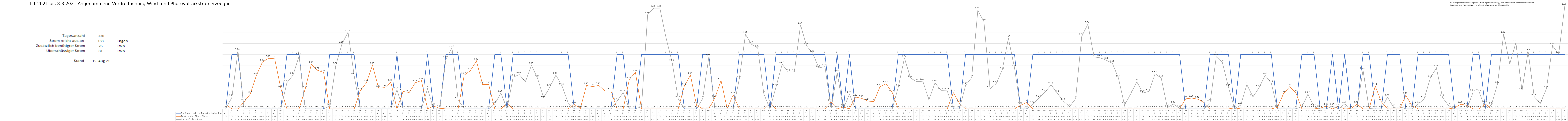
| Category | 1 = Strom reicht im Tagesdurchschnitt aus | Zusätzlich benötigter Strom | Überschüssiger Strom |
|---|---|---|---|
| 0 | 0 | 0.08 | 0 |
| 1 | 1 | 0 | 0.21 |
| 2 | 1 | 0 | 1.06 |
| 3 | 0 | 0.13 | 0 |
| 4 | 0 | 0.27 | 0 |
| 5 | 0 | 0.61 | 0 |
| 6 | 0 | 0.86 | 0 |
| 7 | 0 | 0.93 | 0 |
| 8 | 0 | 0.92 | 0 |
| 9 | 0 | 0.38 | 0 |
| 10 | 1 | 0 | 0.48 |
| 11 | 1 | 0 | 0.62 |
| 12 | 1 | 0 | 0.97 |
| 13 | 0 | 0.37 | 0 |
| 14 | 0 | 0.82 | 0 |
| 15 | 0 | 0.71 | 0 |
| 16 | 0 | 0.67 | 0 |
| 17 | 1 | 0 | 0.05 |
| 18 | 1 | 0 | 0.8 |
| 19 | 1 | 0 | 1.19 |
| 20 | 1 | 0 | 1.41 |
| 21 | 1 | 0 | 0.61 |
| 22 | 0 | 0.33 | 0 |
| 23 | 0 | 0.48 | 0 |
| 24 | 0 | 0.8 | 0 |
| 25 | 0 | 0.38 | 0 |
| 26 | 0 | 0.39 | 0 |
| 27 | 0 | 0.49 | 0 |
| 28 | 1 | 0 | 0.35 |
| 29 | 0 | 0.32 | 0 |
| 30 | 0 | 0.3 | 0 |
| 31 | 0 | 0.48 | 0 |
| 32 | 0 | 0.52 | 0 |
| 33 | 1 | 0 | 0.37 |
| 34 | 0 | 0.05 | 0 |
| 35 | 0 | 0.01 | 0 |
| 36 | 1 | 0 | 0.91 |
| 37 | 1 | 0 | 1.12 |
| 38 | 1 | 0 | 0.17 |
| 39 | 0 | 0.62 | 0 |
| 40 | 0 | 0.7 | 0 |
| 41 | 0 | 0.88 | 0 |
| 42 | 0 | 0.45 | 0 |
| 43 | 0 | 0.45 | 0 |
| 44 | 1 | 0 | 0.09 |
| 45 | 1 | 0 | 0.29 |
| 46 | 0 | 0.1 | 0 |
| 47 | 1 | 0 | 0.58 |
| 48 | 1 | 0 | 0.63 |
| 49 | 1 | 0 | 0.5 |
| 50 | 1 | 0 | 0.8 |
| 51 | 1 | 0 | 0.56 |
| 52 | 1 | 0 | 0.2 |
| 53 | 1 | 0 | 0.4 |
| 54 | 1 | 0 | 0.62 |
| 55 | 1 | 0 | 0.42 |
| 56 | 1 | 0 | 0.11 |
| 57 | 0 | 0.08 | 0 |
| 58 | 0 | 0.01 | 0 |
| 59 | 0 | 0.43 | 0 |
| 60 | 0 | 0.41 | 0 |
| 61 | 0 | 0.43 | 0 |
| 62 | 0 | 0.33 | 0 |
| 63 | 0 | 0.33 | 0 |
| 64 | 1 | 0 | 0.14 |
| 65 | 1 | 0 | 0.3 |
| 66 | 0 | 0.54 | 0 |
| 67 | 0 | 0.67 | 0 |
| 68 | 1 | 0 | 0.04 |
| 69 | 1 | 0 | 1.73 |
| 70 | 1 | 0 | 1.85 |
| 71 | 1 | 0 | 1.85 |
| 72 | 1 | 0 | 1.31 |
| 73 | 1 | 0 | 0.861 |
| 74 | 1 | 0 | 0.185 |
| 75 | 0 | 0.42 | 0 |
| 76 | 0 | 0.619 | 0 |
| 77 | 0 | 0.064 | 0 |
| 78 | 1 | 0 | 0.187 |
| 79 | 1 | 0 | 0.946 |
| 80 | 0 | 0.198 | 0 |
| 81 | 0 | 0.523 | 0 |
| 82 | 0 | 0.007 | 0 |
| 83 | 0 | 0.257 | 0 |
| 84 | 1 | 0 | 0.555 |
| 85 | 1 | 0 | 1.369 |
| 86 | 1 | 0 | 1.186 |
| 87 | 1 | 0 | 1.12 |
| 88 | 1 | 0 | 0.278 |
| 89 | 0 | 0.117 | 0 |
| 90 | 1 | 0 | 0.403 |
| 91 | 1 | 0 | 0.819 |
| 92 | 1 | 0 | 0.676 |
| 93 | 1 | 0 | 0.681 |
| 94 | 1 | 0 | 1.541 |
| 95 | 1 | 0 | 1.158 |
| 96 | 1 | 0 | 1.022 |
| 97 | 1 | 0 | 0.752 |
| 98 | 1 | 0 | 0.776 |
| 99 | 0 | 0.123 | 0 |
| 100 | 1 | 0 | 0.665 |
| 101 | 0 | 0.034 | 0 |
| 102 | 1 | 0 | 0.269 |
| 103 | 0 | 0.218 | 0 |
| 104 | 0 | 0.193 | 0 |
| 105 | 0 | 0.144 | 0 |
| 106 | 0 | 0.133 | 0 |
| 107 | 0 | 0.407 | 0 |
| 108 | 0 | 0.46 | 0 |
| 109 | 0 | 0.3 | 0 |
| 110 | 1 | 0 | 0.402 |
| 111 | 1 | 0 | 0.934 |
| 112 | 1 | 0 | 0.567 |
| 113 | 1 | 0 | 0.498 |
| 114 | 1 | 0 | 0.509 |
| 115 | 1 | 0 | 0.167 |
| 116 | 1 | 0 | 0.478 |
| 117 | 1 | 0 | 0.336 |
| 118 | 1 | 0 | 0.331 |
| 119 | 0 | 0.296 | 0 |
| 120 | 0 | 0.103 | 0 |
| 121 | 1 | 0 | 0.432 |
| 122 | 1 | 0 | 0.575 |
| 123 | 1 | 0 | 1.808 |
| 124 | 1 | 0 | 1.602 |
| 125 | 1 | 0 | 0.369 |
| 126 | 1 | 0 | 0.463 |
| 127 | 1 | 0 | 0.716 |
| 128 | 1 | 0 | 1.296 |
| 129 | 1 | 0 | 0.755 |
| 130 | 0 | 0.067 | 0 |
| 131 | 0 | 0.117 | 0 |
| 132 | 1 | 0 | 0.081 |
| 133 | 1 | 0 | 0.2 |
| 134 | 1 | 0 | 0.31 |
| 135 | 1 | 0 | 0.44 |
| 136 | 1 | 0 | 0.289 |
| 137 | 1 | 0 | 0.142 |
| 138 | 1 | 0 | 0.041 |
| 139 | 1 | 0 | 0.186 |
| 140 | 1 | 0 | 1.332 |
| 141 | 1 | 0 | 1.555 |
| 142 | 1 | 0 | 0.955 |
| 143 | 1 | 0 | 0.938 |
| 144 | 1 | 0 | 0.894 |
| 145 | 1 | 0 | 0.838 |
| 146 | 1 | 0 | 0.567 |
| 147 | 1 | 0 | 0.064 |
| 148 | 1 | 0 | 0.276 |
| 149 | 1 | 0 | 0.498 |
| 150 | 1 | 0 | 0.292 |
| 151 | 1 | 0 | 0.321 |
| 152 | 1 | 0 | 0.646 |
| 153 | 1 | 0 | 0.563 |
| 154 | 1 | 0 | 0.026 |
| 155 | 1 | 0 | 0.087 |
| 156 | 1 | 0 | 0.009 |
| 157 | 0 | 0.184 | 0 |
| 158 | 0 | 0.199 | 0 |
| 159 | 0 | 0.177 | 0 |
| 160 | 0 | 0.116 | 0 |
| 161 | 1 | 0 | 0.12 |
| 162 | 1 | 0 | 0.959 |
| 163 | 1 | 0 | 0.851 |
| 164 | 1 | 0 | 0.397 |
| 165 | 0 | 0.017 | 0 |
| 166 | 1 | 0 | 0.069 |
| 167 | 1 | 0 | 0.445 |
| 168 | 1 | 0 | 0.221 |
| 169 | 1 | 0 | 0.389 |
| 170 | 1 | 0 | 0.615 |
| 171 | 1 | 0 | 0.476 |
| 172 | 0 | 0.027 | 0 |
| 173 | 0 | 0.28 | 0 |
| 174 | 0 | 0.406 | 0 |
| 175 | 0 | 0.3 | 0 |
| 176 | 1 | 0 | 0.042 |
| 177 | 1 | 0 | 0.271 |
| 178 | 1 | 0 | 0.038 |
| 179 | 0 | 0.014 | 0 |
| 180 | 0 | 0.049 | 0 |
| 181 | 1 | 0 | 0.046 |
| 182 | 0 | 0.038 | 0 |
| 183 | 1 | 0 | 0.09 |
| 184 | 0 | 0.005 | 0 |
| 185 | 0 | 0.084 | 0 |
| 186 | 1 | 0 | 0.711 |
| 187 | 1 | 0 | 0.006 |
| 188 | 0 | 0.419 | 0 |
| 189 | 0 | 0.129 | 0 |
| 190 | 1 | 0 | 0.215 |
| 191 | 1 | 0 | 0.026 |
| 192 | 1 | 0 | 0.038 |
| 193 | 0 | 0.249 | 0 |
| 194 | 0 | 0.057 | 0 |
| 195 | 1 | 0 | 0.084 |
| 196 | 1 | 0 | 0.185 |
| 197 | 1 | 0 | 0.563 |
| 198 | 1 | 0 | 0.753 |
| 199 | 1 | 0 | 0.212 |
| 200 | 1 | 0 | 0.058 |
| 201 | 0 | 0.018 | 0 |
| 202 | 0 | 0.087 | 0 |
| 203 | 0 | 0.063 | 0 |
| 204 | 1 | 0 | 0.307 |
| 205 | 1 | 0 | 0.312 |
| 206 | 0 | 0.092 | 0 |
| 207 | 1 | 0 | 0.071 |
| 208 | 1 | 0 | 0.458 |
| 209 | 1 | 0 | 1.377 |
| 210 | 1 | 0 | 0.826 |
| 211 | 1 | 0 | 1.216 |
| 212 | 1 | 0 | 0.333 |
| 213 | 1 | 0 | 1.052 |
| 214 | 1 | 0 | 0.224 |
| 215 | 1 | 0 | 0.103 |
| 216 | 1 | 0 | 0.368 |
| 217 | 1 | 0 | 1.16 |
| 218 | 1 | 0 | 1.006 |
| 219 | 1 | 0 | 1.888 |